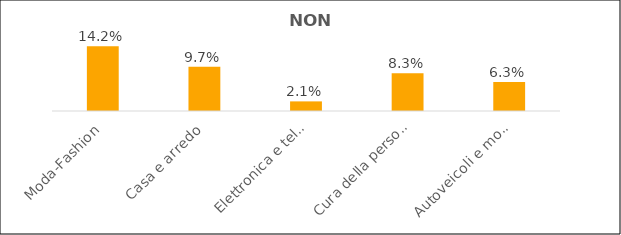
| Category | Series 0 |
|---|---|
| Moda-Fashion | 0.142 |
| Casa e arredo | 0.097 |
| Elettronica e telecomunicazioni | 0.021 |
| Cura della persona, sport e tempo libero | 0.083 |
| Autoveicoli e motocicli | 0.063 |